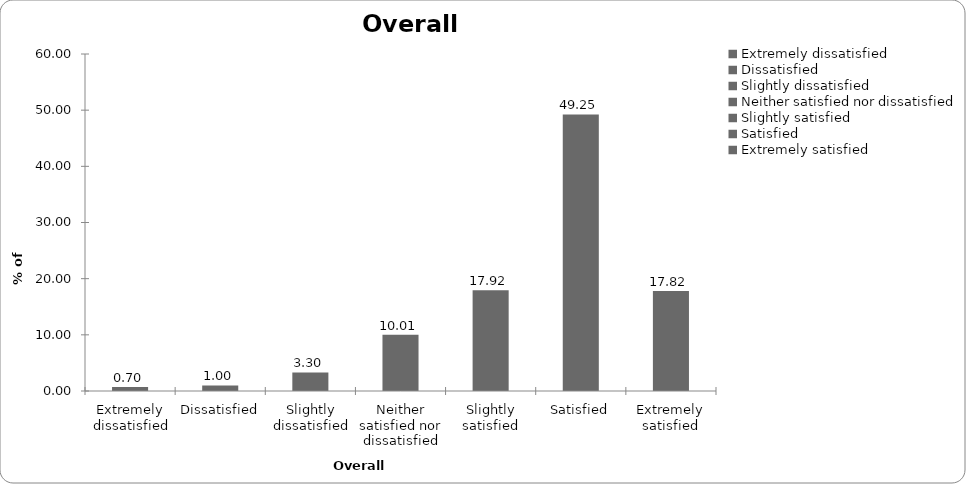
| Category | Overall satisfaction |
|---|---|
| Extremely dissatisfied | 0.701 |
| Dissatisfied | 1.001 |
| Slightly dissatisfied | 3.303 |
| Neither satisfied nor dissatisfied | 10.01 |
| Slightly satisfied | 17.918 |
| Satisfied | 49.249 |
| Extremely satisfied | 17.818 |